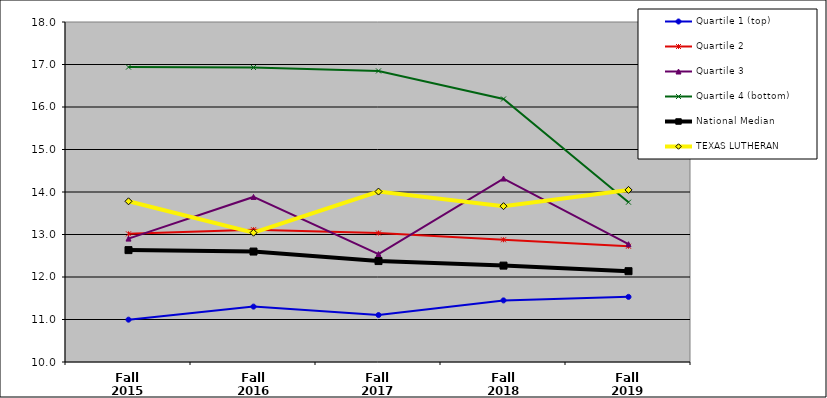
| Category | Quartile 1 (top) | Quartile 2 | Quartile 3 | Quartile 4 (bottom) | National Median | TEXAS LUTHERAN |
|---|---|---|---|---|---|---|
| Fall 2015 | 10.996 | 13.016 | 12.903 | 16.939 | 12.633 | 13.781 |
| Fall 2016 | 11.303 | 13.113 | 13.884 | 16.93 | 12.599 | 13.042 |
| Fall 2017 | 11.105 | 13.035 | 12.54 | 16.849 | 12.375 | 14.01 |
| Fall 2018 | 11.45 | 12.876 | 14.317 | 16.189 | 12.268 | 13.667 |
| Fall 2019 | 11.532 | 12.723 | 12.771 | 13.76 | 12.137 | 14.049 |